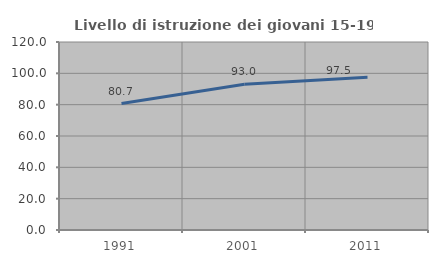
| Category | Livello di istruzione dei giovani 15-19 anni |
|---|---|
| 1991.0 | 80.69 |
| 2001.0 | 93.023 |
| 2011.0 | 97.514 |